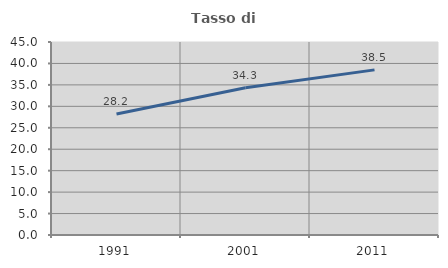
| Category | Tasso di occupazione   |
|---|---|
| 1991.0 | 28.221 |
| 2001.0 | 34.313 |
| 2011.0 | 38.501 |